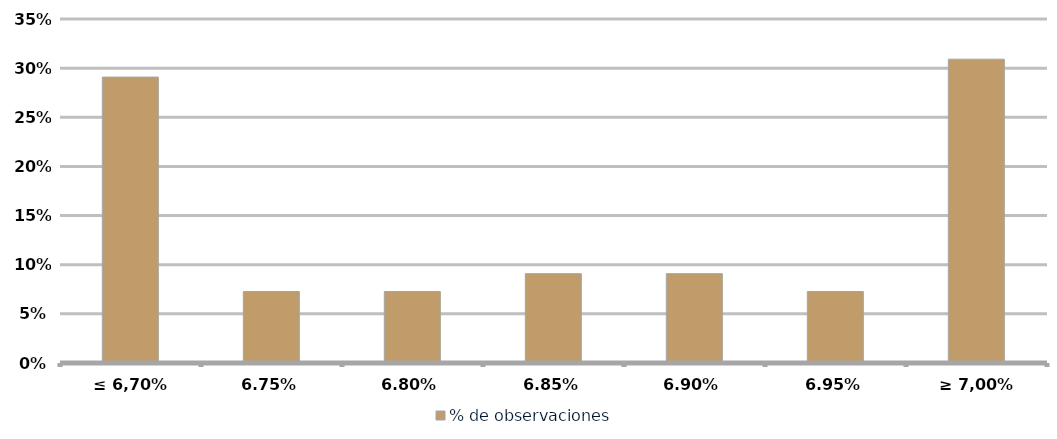
| Category | % de observaciones  |
|---|---|
| ≤ 6,70% | 0.291 |
| 6,75% | 0.073 |
| 6,80% | 0.073 |
| 6,85% | 0.091 |
| 6,90% | 0.091 |
| 6,95% | 0.073 |
| ≥ 7,00% | 0.309 |